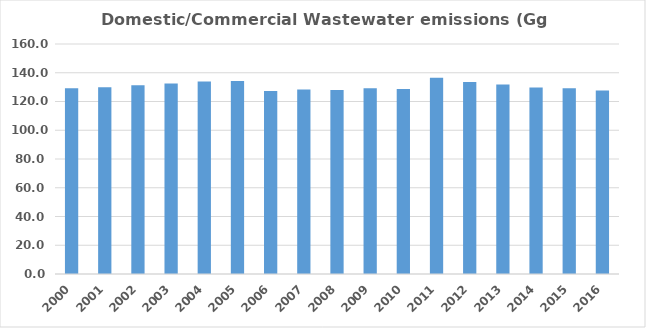
| Category | Series 0 |
|---|---|
| 2000.0 | 129.244 |
| 2001.0 | 129.89 |
| 2002.0 | 131.286 |
| 2003.0 | 132.505 |
| 2004.0 | 133.872 |
| 2005.0 | 134.334 |
| 2006.0 | 127.314 |
| 2007.0 | 128.427 |
| 2008.0 | 128.003 |
| 2009.0 | 129.246 |
| 2010.0 | 128.613 |
| 2011.0 | 136.575 |
| 2012.0 | 133.62 |
| 2013.0 | 131.767 |
| 2014.0 | 129.792 |
| 2015.0 | 129.208 |
| 2016.0 | 127.608 |